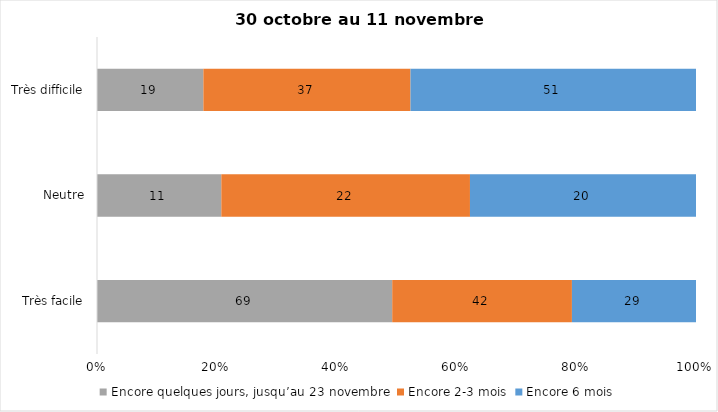
| Category | Encore quelques jours, jusqu’au 23 novembre | Encore 2-3 mois | Encore 6 mois |
|---|---|---|---|
| Très facile | 69 | 42 | 29 |
| Neutre | 11 | 22 | 20 |
| Très difficile | 19 | 37 | 51 |